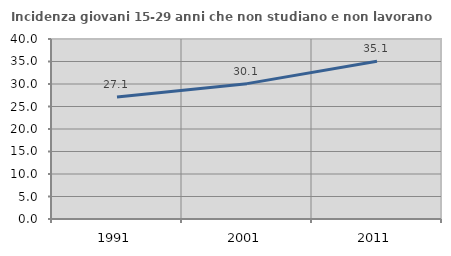
| Category | Incidenza giovani 15-29 anni che non studiano e non lavorano  |
|---|---|
| 1991.0 | 27.127 |
| 2001.0 | 30.081 |
| 2011.0 | 35.057 |